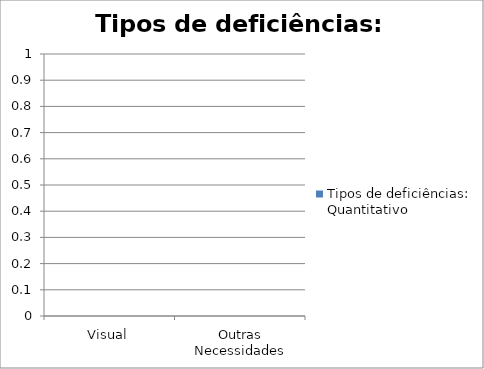
| Category | Tipos de deficiências: Quantitativo |
|---|---|
| Visual | 0 |
| Outras Necessidades | 0 |